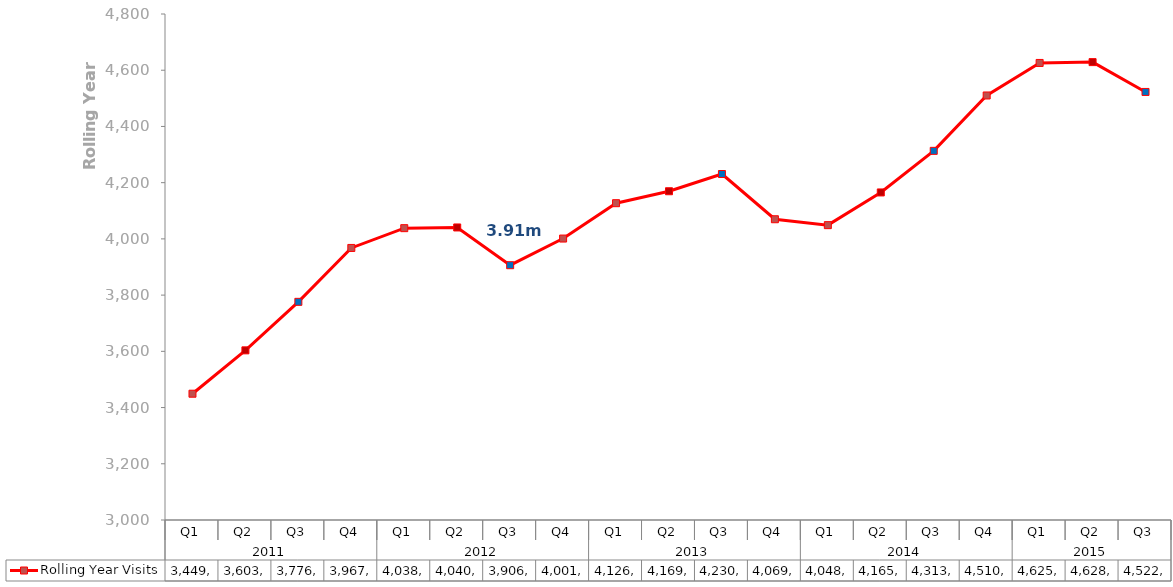
| Category | Rolling Year Visits  |
|---|---|
| 0 | 3449234.585 |
| 1 | 3603503.025 |
| 2 | 3776061.835 |
| 3 | 3967761.054 |
| 4 | 4038147.282 |
| 5 | 4040646.027 |
| 6 | 3906359.647 |
| 7 | 4001207.741 |
| 8 | 4126969.813 |
| 9 | 4169512.797 |
| 10 | 4230719.984 |
| 11 | 4069889.221 |
| 12 | 4048880.993 |
| 13 | 4165189.259 |
| 14 | 4313171.598 |
| 15 | 4510184.178 |
| 16 | 4625882.529 |
| 17 | 4628841.064 |
| 18 | 4522739.83 |